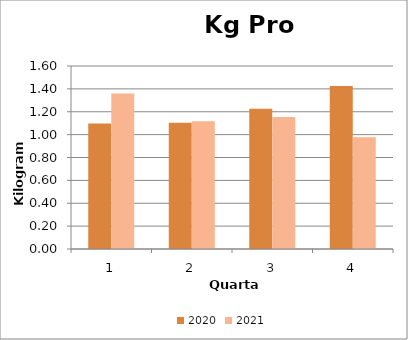
| Category | 2020 | 2021 |
|---|---|---|
| 0 | 1.097 | 1.359 |
| 1 | 1.103 | 1.117 |
| 2 | 1.226 | 1.153 |
| 3 | 1.426 | 0.977 |